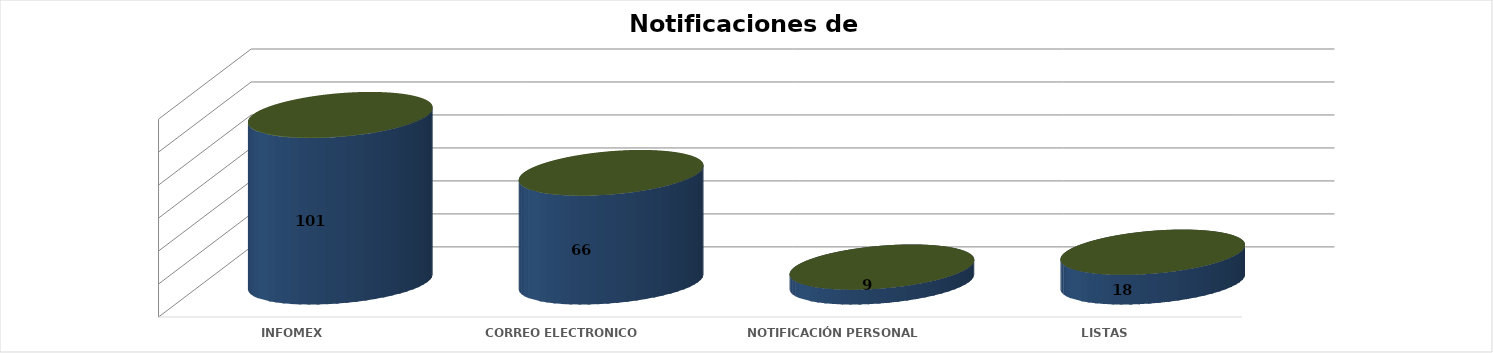
| Category | Series 0 | Series 1 | Series 2 | Series 3 | Series 4 |
|---|---|---|---|---|---|
| INFOMEX |  |  |  | 101 | 0.521 |
| CORREO ELECTRONICO |  |  |  | 66 | 0.34 |
| NOTIFICACIÓN PERSONAL |  |  |  | 9 | 0.046 |
| LISTAS |  |  |  | 18 | 0.093 |